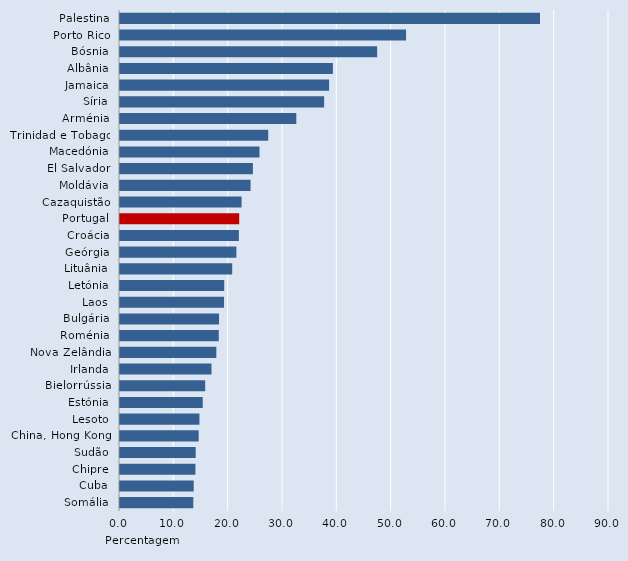
| Category | Series 0 |
|---|---|
| Palestina | 77.3 |
| Porto Rico | 52.65 |
| Bósnia | 47.33 |
| Albânia | 39.18 |
| Jamaica | 38.48 |
| Síria | 37.57 |
| Arménia | 32.45 |
| Trinidad e Tobago | 27.28 |
| Macedónia | 25.67 |
| El Salvador | 24.46 |
| Moldávia | 24.03 |
| Cazaquistão | 22.38 |
| Portugal | 21.94 |
| Croácia | 21.88 |
| Geórgia | 21.42 |
| Lituânia | 20.65 |
| Letónia | 19.18 |
| Laos | 19.15 |
| Bulgária | 18.23 |
| Roménia | 18.18 |
| Nova Zelândia | 17.73 |
| Irlanda | 16.84 |
| Bielorrússia | 15.68 |
| Estónia | 15.23 |
| Lesoto | 14.62 |
| China, Hong Kong | 14.48 |
| Sudão | 13.93 |
| Chipre | 13.88 |
| Cuba | 13.57 |
| Somália | 13.49 |